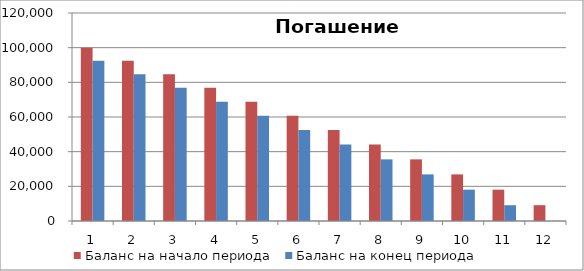
| Category | Баланс на начало периода | Баланс на конец периода |
|---|---|---|
| 0 | 100000 | 92403.216 |
| 1 | 92403.216 | 84679.819 |
| 2 | 84679.819 | 76827.699 |
| 3 | 76827.699 | 68844.71 |
| 4 | 68844.71 | 60728.671 |
| 5 | 60728.671 | 52477.365 |
| 6 | 52477.365 | 44088.537 |
| 7 | 44088.537 | 35559.896 |
| 8 | 35559.896 | 26889.11 |
| 9 | 26889.11 | 18073.811 |
| 10 | 18073.811 | 9111.591 |
| 11 | 9111.591 | 0 |